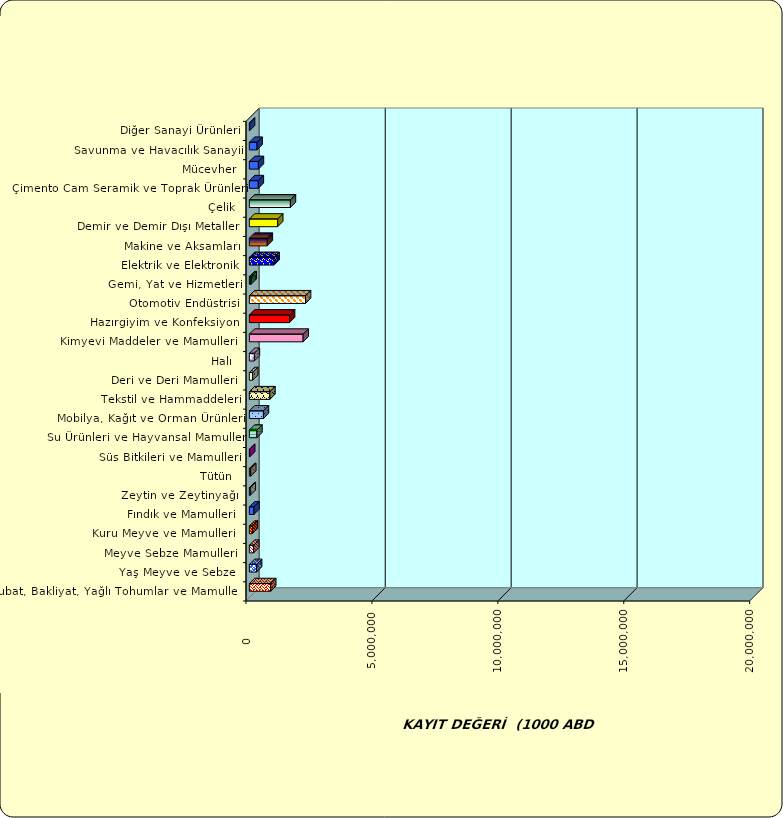
| Category | Series 0 |
|---|---|
|  Hububat, Bakliyat, Yağlı Tohumlar ve Mamulleri  | 847975.293 |
|  Yaş Meyve ve Sebze   | 286840.569 |
|  Meyve Sebze Mamulleri  | 173304.867 |
|  Kuru Meyve ve Mamulleri   | 119660.407 |
|  Fındık ve Mamulleri  | 182655.118 |
|  Zeytin ve Zeytinyağı  | 37546.48 |
|  Tütün  | 54249.011 |
|  Süs Bitkileri ve Mamulleri | 12438.055 |
|  Su Ürünleri ve Hayvansal Mamuller | 301015.833 |
|  Mobilya, Kağıt ve Orman Ürünleri | 559231.254 |
|  Tekstil ve Hammaddeleri | 816325.484 |
|  Deri ve Deri Mamulleri  | 133310.577 |
|  Halı  | 198754.48 |
|  Kimyevi Maddeler ve Mamulleri   | 2135682.802 |
|  Hazırgiyim ve Konfeksiyon  | 1596441.397 |
|  Otomotiv Endüstrisi | 2230188.58 |
|  Gemi, Yat ve Hizmetleri | 71039.355 |
|  Elektrik ve Elektronik | 982940.488 |
|  Makine ve Aksamları | 713043.574 |
|  Demir ve Demir Dışı Metaller  | 1125174.535 |
|  Çelik | 1630510.978 |
|  Çimento Cam Seramik ve Toprak Ürünleri | 356097.139 |
|  Mücevher | 359441.342 |
|  Savunma ve Havacılık Sanayii | 306811.096 |
|  Diğer Sanayi Ürünleri | 8216.656 |